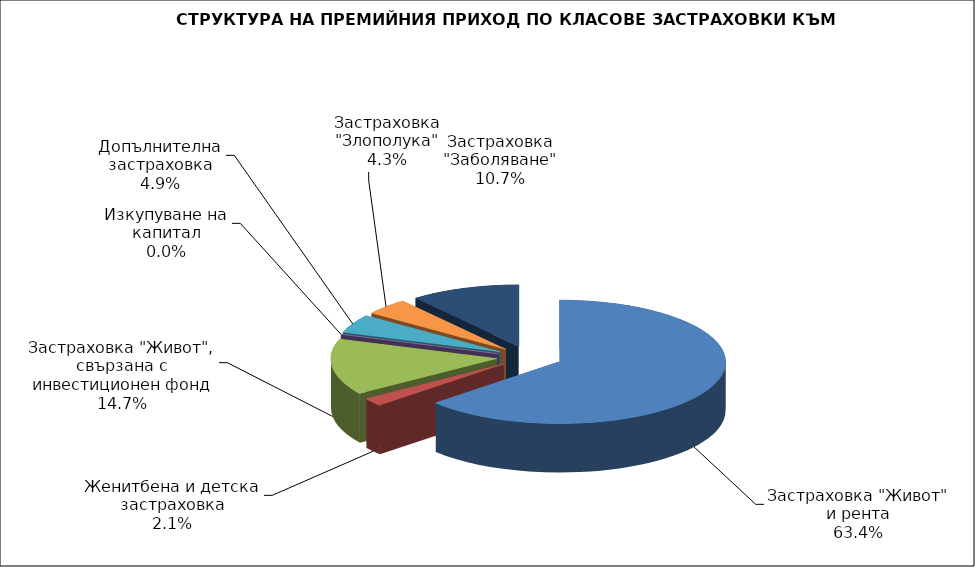
| Category | Series 0 |
|---|---|
| Застраховка "Живот" и рента | 233528999.461 |
| Женитбена и детска застраховка | 7624630.601 |
| Застраховка "Живот", свързана с инвестиционен фонд | 54028234.055 |
| Изкупуване на капитал | 0 |
| Допълнителна застраховка | 17999900.111 |
| Застраховка "Злополука" | 15918159.33 |
| Застраховка "Заболяване" | 39301313.57 |